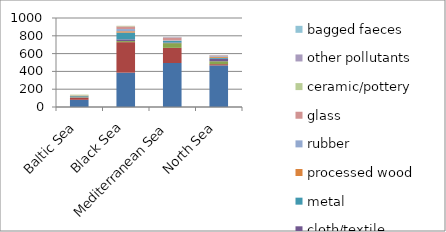
| Category | plastic / polystyrene | paper/cardboard | sanitary | cloth/textile | metal | processed wood | rubber | glass | ceramic/pottery | other pollutants | bagged faeces |
|---|---|---|---|---|---|---|---|---|---|---|---|
| Baltic Sea | 80.809 | 23.059 | 4.73 | 3.151 | 9.763 | 5.592 | 1.559 | 1.789 | 8.401 | 0.23 | 0.322 |
| Black Sea | 386 | 342.571 | 12.286 | 19 | 75.857 | 15.429 | 24.571 | 29.714 | 7 | 0 | 0 |
| Mediterranean Sea | 494.636 | 169.818 | 53.03 | 7.03 | 17.818 | 2.485 | 5.273 | 29.03 | 2.061 | 6.182 | 0.121 |
| North Sea | 467.106 | 14.258 | 32.464 | 27.596 | 11.086 | 12.689 | 10.046 | 5.583 | 1.232 | 1.987 | 0.371 |